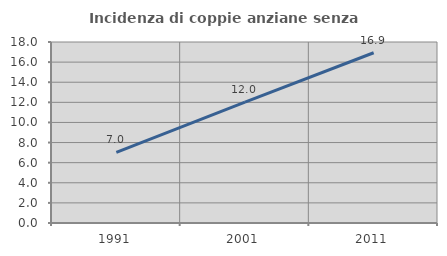
| Category | Incidenza di coppie anziane senza figli  |
|---|---|
| 1991.0 | 7.023 |
| 2001.0 | 12.027 |
| 2011.0 | 16.933 |